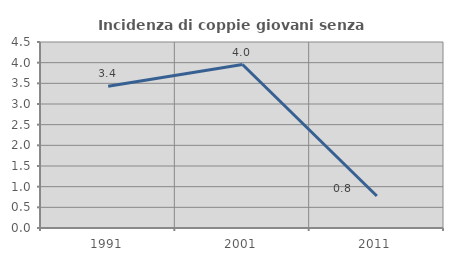
| Category | Incidenza di coppie giovani senza figli |
|---|---|
| 1991.0 | 3.431 |
| 2001.0 | 3.955 |
| 2011.0 | 0.775 |